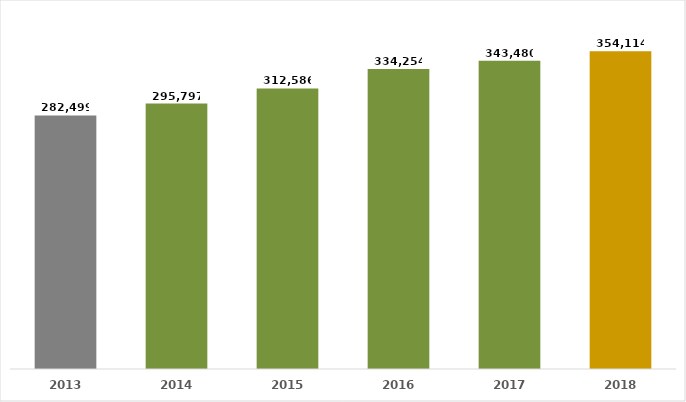
| Category | Series 0 |
|---|---|
| 2013.0 | 282499 |
| 2014.0 | 295797 |
| 2015.0 | 312586 |
| 2016.0 | 334254 |
| 2017.0 | 343480 |
| 2018.0 | 354114 |